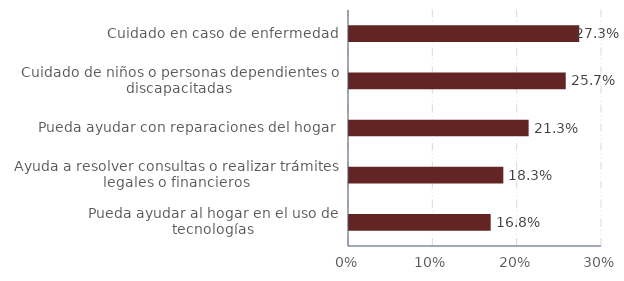
| Category | Solo Adulto Mayor |
|---|---|
| Pueda ayudar al hogar en el uso de tecnologías | 0.168 |
| Ayuda a resolver consultas o realizar trámites legales o financieros | 0.183 |
| Pueda ayudar con reparaciones del hogar  | 0.213 |
| Cuidado de niños o personas dependientes o discapacitadas | 0.257 |
| Cuidado en caso de enfermedad | 0.273 |